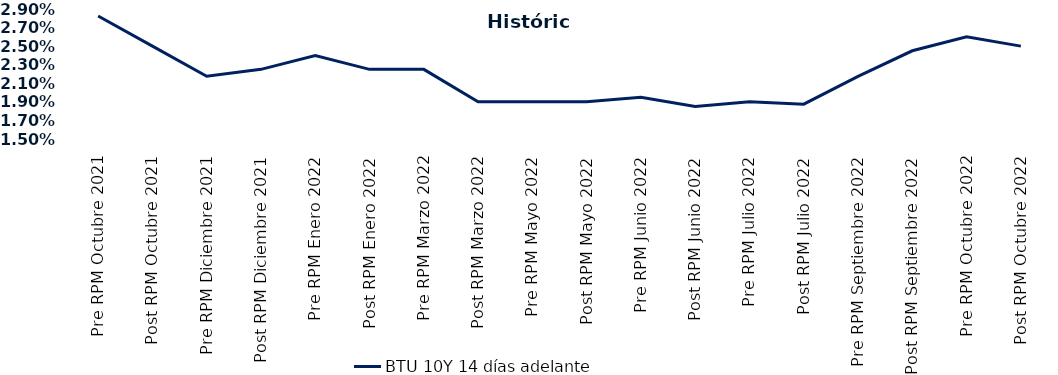
| Category | BTU 10Y 14 días adelante |
|---|---|
| Pre RPM Octubre 2021 | 0.028 |
| Post RPM Octubre 2021 | 0.025 |
| Pre RPM Diciembre 2021 | 0.022 |
| Post RPM Diciembre 2021 | 0.022 |
| Pre RPM Enero 2022 | 0.024 |
| Post RPM Enero 2022 | 0.022 |
| Pre RPM Marzo 2022 | 0.022 |
| Post RPM Marzo 2022 | 0.019 |
| Pre RPM Mayo 2022 | 0.019 |
| Post RPM Mayo 2022 | 0.019 |
| Pre RPM Junio 2022 | 0.02 |
| Post RPM Junio 2022 | 0.018 |
| Pre RPM Julio 2022 | 0.019 |
| Post RPM Julio 2022 | 0.019 |
| Pre RPM Septiembre 2022 | 0.022 |
| Post RPM Septiembre 2022 | 0.024 |
| Pre RPM Octubre 2022 | 0.026 |
| Post RPM Octubre 2022 | 0.025 |